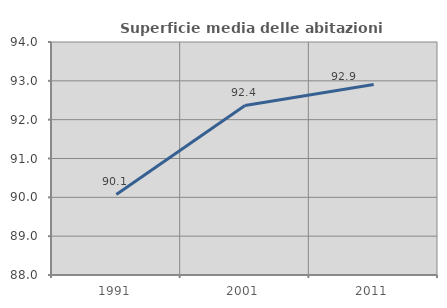
| Category | Superficie media delle abitazioni occupate |
|---|---|
| 1991.0 | 90.075 |
| 2001.0 | 92.365 |
| 2011.0 | 92.905 |